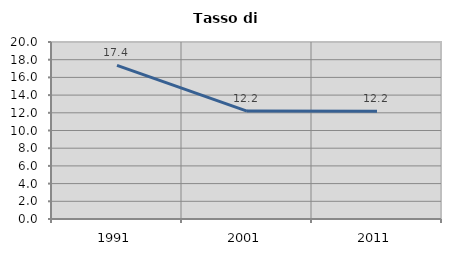
| Category | Tasso di disoccupazione   |
|---|---|
| 1991.0 | 17.35 |
| 2001.0 | 12.198 |
| 2011.0 | 12.183 |